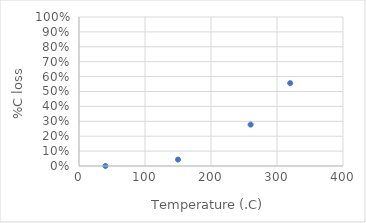
| Category | Total C (mg/g) |
|---|---|
| 40.0 | 0 |
| 150.0 | 0.043 |
| 260.0 | 0.278 |
| 320.0 | 0.556 |